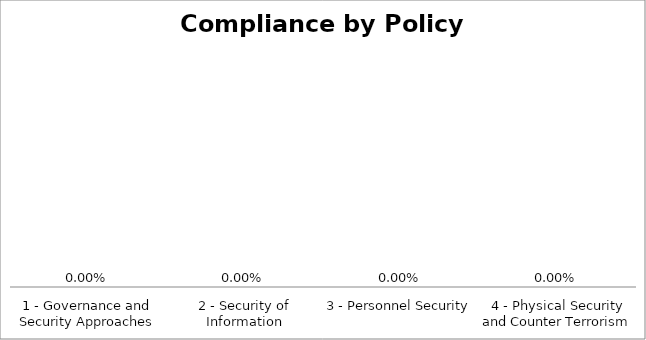
| Category | Compliance by Policy Area |
|---|---|
| 1 - Governance and Security Approaches | 0 |
| 2 - Security of Information | 0 |
| 3 - Personnel Security | 0 |
| 4 - Physical Security and Counter Terrorism | 0 |